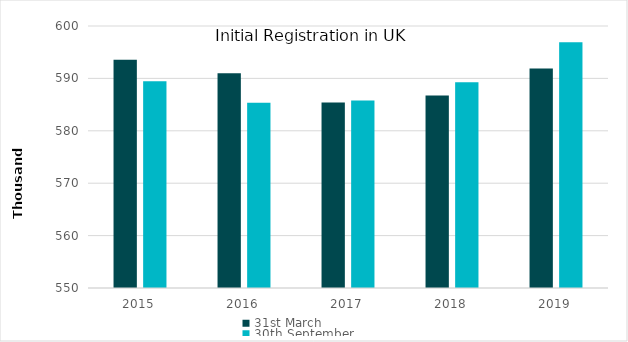
| Category | 31st March | 30th September |
|---|---|---|
| 2015.0 | 593548 | 589472 |
| 2016.0 | 590991 | 585369 |
| 2017.0 | 585404 | 585796 |
| 2018.0 | 586725 | 589253 |
| 2019.0 | 591894 | 596906 |